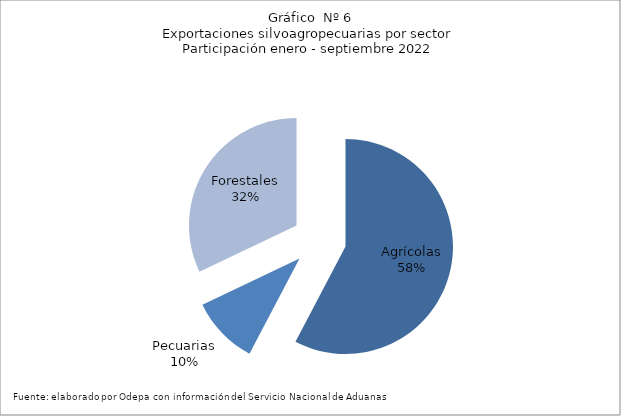
| Category | Series 0 |
|---|---|
| Agrícolas | 8450595 |
| Pecuarias | 1495755 |
| Forestales | 4697919 |